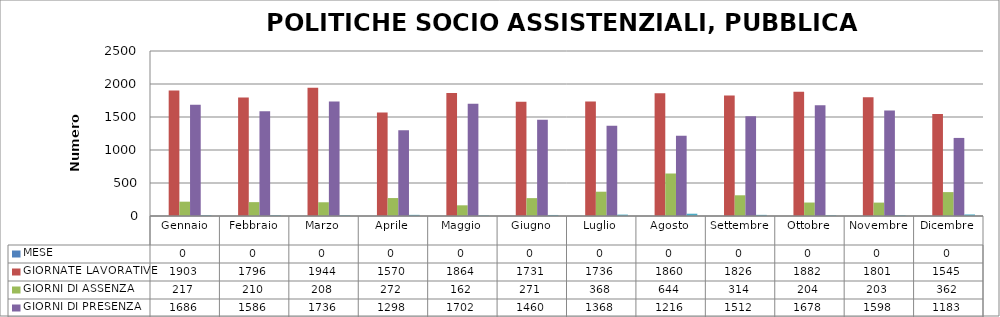
| Category | MESE | GIORNATE LAVORATIVE | GIORNI DI ASSENZA | GIORNI DI PRESENZA | %  ASSENZA |
|---|---|---|---|---|---|
| Gennaio | 0 | 1903 | 217 | 1686 | 11.403 |
| Febbraio | 0 | 1796 | 210 | 1586 | 11.693 |
| Marzo | 0 | 1944 | 208 | 1736 | 10.7 |
| Aprile | 0 | 1570 | 272 | 1298 | 17.325 |
| Maggio | 0 | 1864 | 162 | 1702 | 8.691 |
| Giugno | 0 | 1731 | 271 | 1460 | 15.656 |
| Luglio | 0 | 1736 | 368 | 1368 | 21.198 |
| Agosto | 0 | 1860 | 644 | 1216 | 34.624 |
| Settembre | 0 | 1826 | 314 | 1512 | 17.196 |
| Ottobre | 0 | 1882 | 204 | 1678 | 10.84 |
| Novembre | 0 | 1801 | 203 | 1598 | 11.272 |
| Dicembre | 0 | 1545 | 362 | 1183 | 23.43 |